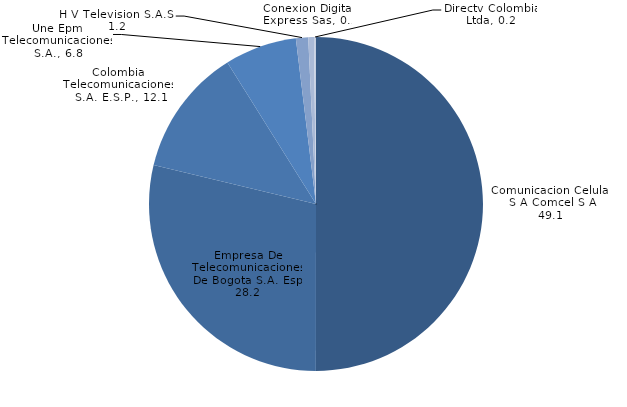
| Category | Series 2 |
|---|---|
| Comunicacion Celular S A Comcel S A | 49.082 |
| Empresa De Telecomunicaciones De Bogota S.A. Esp | 28.202 |
| Colombia Telecomunicaciones S.A. E.S.P. | 12.122 |
| Une Epm Telecomunicaciones S.A. | 6.843 |
| H V Television S.A.S. | 1.167 |
| Conexion Digital Express Sas | 0.541 |
| Directv Colombia Ltda | 0.187 |